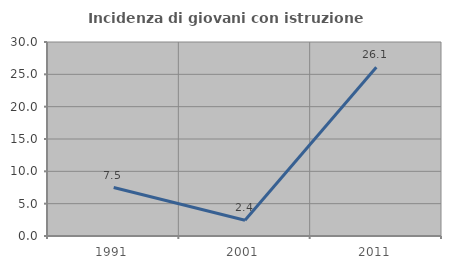
| Category | Incidenza di giovani con istruzione universitaria |
|---|---|
| 1991.0 | 7.5 |
| 2001.0 | 2.439 |
| 2011.0 | 26.087 |